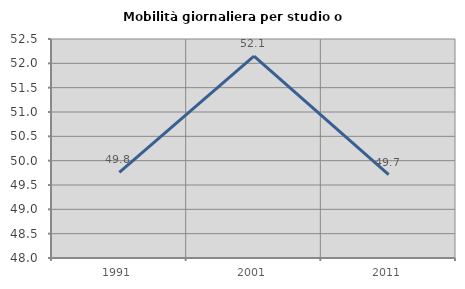
| Category | Mobilità giornaliera per studio o lavoro |
|---|---|
| 1991.0 | 49.759 |
| 2001.0 | 52.148 |
| 2011.0 | 49.713 |